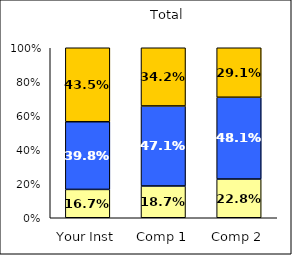
| Category | Low Career Related Stress | Average Career Related Stress | High Career Related Stress |
|---|---|---|---|
| Your Inst | 0.167 | 0.398 | 0.435 |
| Comp 1 | 0.187 | 0.471 | 0.342 |
| Comp 2 | 0.228 | 0.481 | 0.291 |